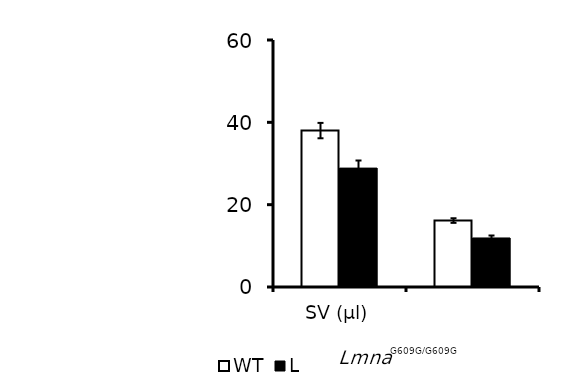
| Category | WT | Lmna |
|---|---|---|
| SV (μl) | 37.996 | 28.881 |
| CO (ml/min) | 16.14 | 11.912 |